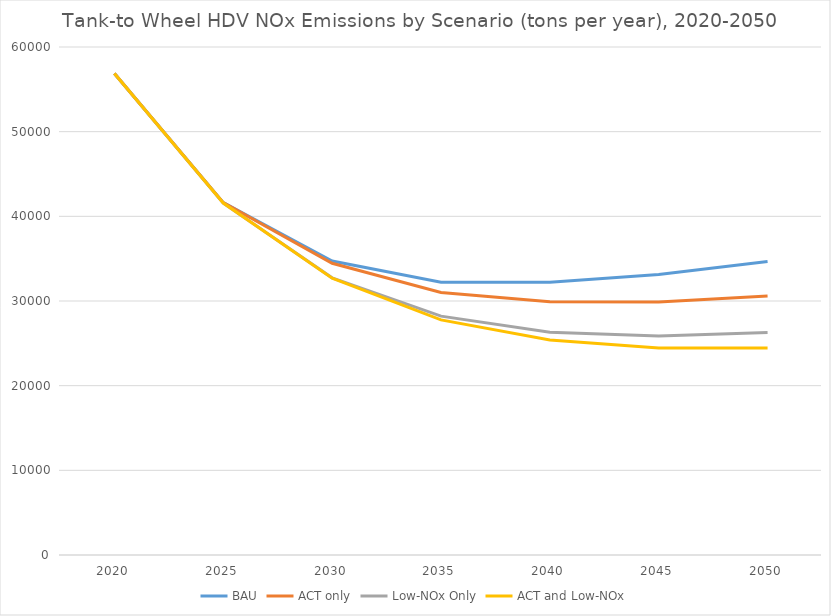
| Category | BAU | ACT only | Low-NOx Only | ACT and Low-NOx |
|---|---|---|---|---|
| 2020.0 | 56869.271 | 56869.271 | 56869.271 | 56869.271 |
| 2025.0 | 41616.553 | 41616.553 | 41561.509 | 41564.53 |
| 2030.0 | 34722.224 | 34456.658 | 32734.351 | 32691.92 |
| 2035.0 | 32218.298 | 30995.553 | 28212.04 | 27770.794 |
| 2040.0 | 32202.619 | 29925.331 | 26320.215 | 25389.263 |
| 2045.0 | 33140.133 | 29881.418 | 25859.869 | 24439.538 |
| 2050.0 | 34670.42 | 30596.871 | 26273.543 | 24447.082 |